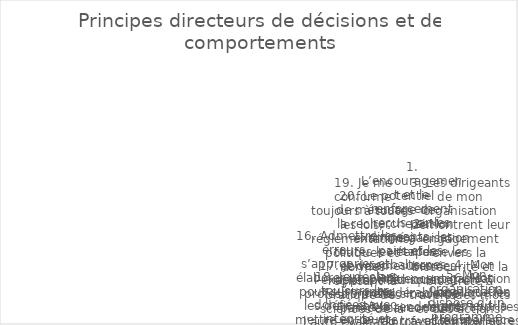
| Category | Series 0 |
|---|---|
| 1. L’encouragement et le renforcement reçus par les dirigeants, les pairs et les subalternes influencent considérablement le rendement au travail. | 4 |
| 2. Mon organisation renforce les normes éthiques et un code de conduite professionnel. | 4 |
| 3. Les dirigeants de mon organisation démontrent leur engagement envers la biosécurité et la biosûreté à travers des mots et des actions. | 5 |
| 4. Mon organisation applique les leçons apprises et les meilleures pratiques. | 5 |
| 5. Mon organisation dispose d’un programme d’atténuation des menaces internes. | 5 |
| 6. Mon organisation promeut la transparence publique en ce qui concerne sa conformité aux exigences de biosécurité et de biosûreté. | 2 |
| 7. Chacun partage sa responsabilité personnelle en matière de de biosécurité et de biosûreté. | 4 |
| 8. Je connais le concept et les implications de la recherche préoccupante à double usage. | 1 |
| 9. Des personnes dûment qualifiées et formées assurent la surveillance de la biosécurité et de la biosûreté. | 2 |
| 10. Lorsqu’un incident ou un quasi-accident se produit, les gens procèdent à un remue-méninge au lieu de se blâmer. La question posée est « qu’est-ce qui a mal tourné ? » pas « qui avait tort ? », en se concentrant sur l’amélioration, pas sur le blâme. | 0 |
| 11. Je considère les implications et les applications possibles de mon travail et l’équilibre entre la recherche de connaissances scientifiques et mes responsabilités éthiques envers la société. | 2 |
| 12. Je suis motivé pour minimiser les risques de mésusage de la science pour la société. | 2 |
| 13. Je suis conscient de la menace du bioterrorisme et des armes biologiques. | 1 |
| 14. Mon organisation a mis en place un code de conduite responsable. | 2 |
| 15. Les normes sont appliquées dans mon organisation. | 1 |
| 16. Admettre les erreurs, s’approprier et élaborer un plan pour surmonter les défis et/ou mettre en œuvre des mesures correctives font partie intégrante d’une biosécurité et d’une biosûreté efficaces. | 5 |
| 17. Je vise l’excellence professionnelle par l’auto-évaluation et la formation continue. | 5 |
| 18. Je déclare toujours les données avec intégrité et précision. | 3 |
| 19. Je me conforme toujours à toutes les lois, réglementations, politiques et normes régissant la pratique des sciences de la vie. | 2 |
| 20. Le potentiel de mésusage de la recherche est examiné à toutes les étapes et des mesures appropriées sont prises si nécessaire. | 0 |